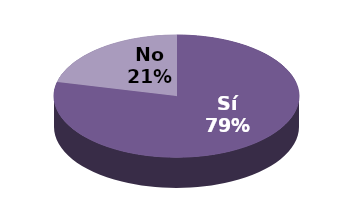
| Category | Series 1 |
|---|---|
| Sí | 37 |
| No | 10 |